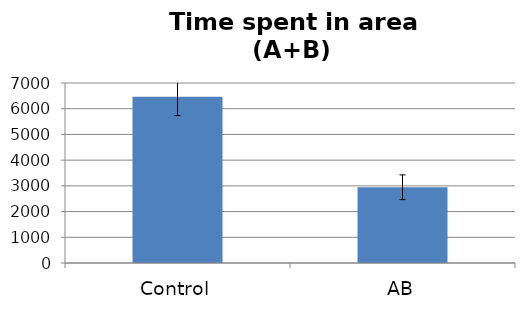
| Category | Average |
|---|---|
| Control | 6465.318 |
| AB | 2945.167 |